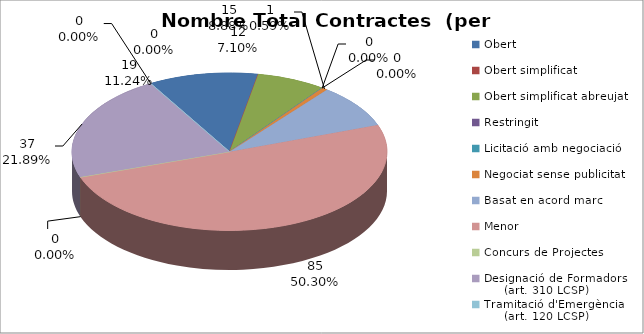
| Category | Nombre Total Contractes |
|---|---|
| Obert | 19 |
| Obert simplificat | 0 |
| Obert simplificat abreujat | 12 |
| Restringit | 0 |
| Licitació amb negociació | 0 |
| Negociat sense publicitat | 1 |
| Basat en acord marc | 15 |
| Menor | 85 |
| Concurs de Projectes | 0 |
| Designació de Formadors
     (art. 310 LCSP) | 37 |
| Tramitació d'Emergència
     (art. 120 LCSP) | 0 |